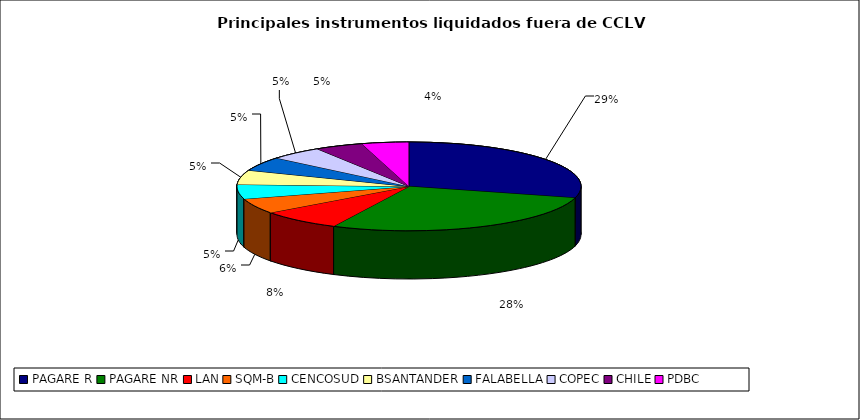
| Category | Series 0 |
|---|---|
| PAGARE R | 1945 |
| PAGARE NR | 1867 |
| LAN | 513 |
| SQM-B | 369 |
| CENCOSUD | 350 |
| BSANTANDER | 347 |
| FALABELLA | 341 |
| COPEC | 333 |
| CHILE | 302 |
| PDBC | 295 |